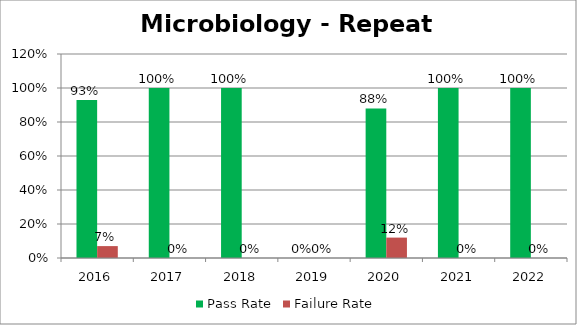
| Category | Pass Rate | Failure Rate |
|---|---|---|
| 2016.0 | 0.93 | 0.07 |
| 2017.0 | 1 | 0 |
| 2018.0 | 1 | 0 |
| 2019.0 | 0 | 0 |
| 2020.0 | 0.88 | 0.12 |
| 2021.0 | 1 | 0 |
| 2022.0 | 1 | 0 |